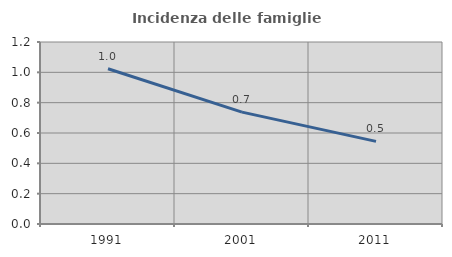
| Category | Incidenza delle famiglie numerose |
|---|---|
| 1991.0 | 1.023 |
| 2001.0 | 0.737 |
| 2011.0 | 0.545 |